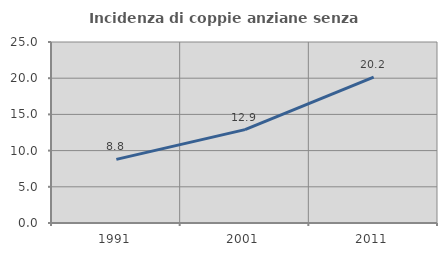
| Category | Incidenza di coppie anziane senza figli  |
|---|---|
| 1991.0 | 8.785 |
| 2001.0 | 12.897 |
| 2011.0 | 20.154 |